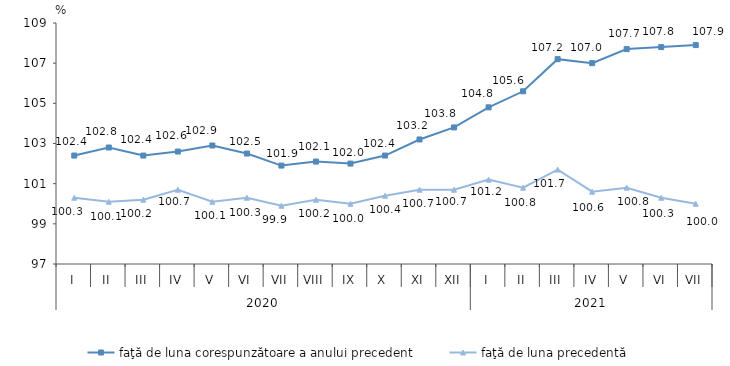
| Category | faţă de luna corespunzătoare a anului precedent | faţă de luna precedentă   |
|---|---|---|
| 0 | 102.4 | 100.3 |
| 1 | 102.8 | 100.1 |
| 2 | 102.4 | 100.2 |
| 3 | 102.6 | 100.7 |
| 4 | 102.9 | 100.1 |
| 5 | 102.5 | 100.3 |
| 6 | 101.9 | 99.9 |
| 7 | 102.1 | 100.2 |
| 8 | 102 | 100 |
| 9 | 102.4 | 100.4 |
| 10 | 103.2 | 100.7 |
| 11 | 103.8 | 100.7 |
| 12 | 104.8 | 101.2 |
| 13 | 105.6 | 100.8 |
| 14 | 107.2 | 101.7 |
| 15 | 107 | 100.6 |
| 16 | 107.7 | 100.8 |
| 17 | 107.8 | 100.3 |
| 18 | 107.9 | 100 |